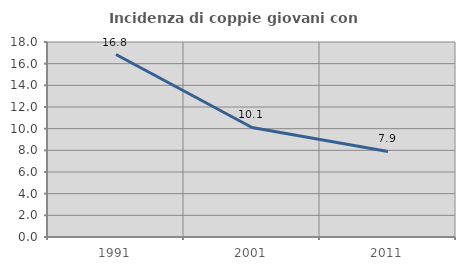
| Category | Incidenza di coppie giovani con figli |
|---|---|
| 1991.0 | 16.846 |
| 2001.0 | 10.112 |
| 2011.0 | 7.901 |